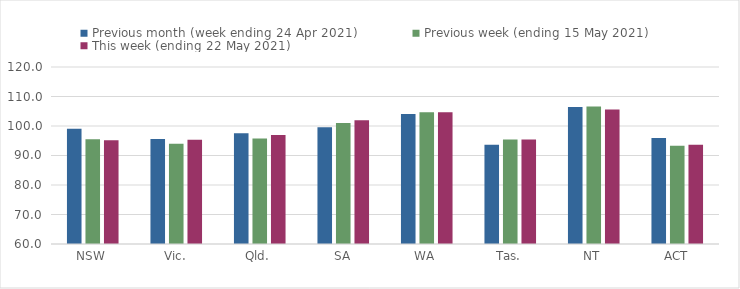
| Category | Previous month (week ending 24 Apr 2021) | Previous week (ending 15 May 2021) | This week (ending 22 May 2021) |
|---|---|---|---|
| NSW | 99.08 | 95.55 | 95.13 |
| Vic. | 95.61 | 93.99 | 95.33 |
| Qld. | 97.55 | 95.74 | 96.94 |
| SA | 99.58 | 101.05 | 101.94 |
| WA | 104.03 | 104.7 | 104.63 |
| Tas. | 93.66 | 95.39 | 95.41 |
| NT | 106.45 | 106.65 | 105.6 |
| ACT | 95.9 | 93.29 | 93.64 |